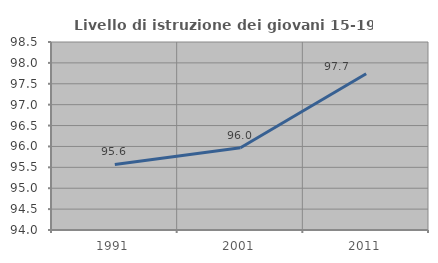
| Category | Livello di istruzione dei giovani 15-19 anni |
|---|---|
| 1991.0 | 95.57 |
| 2001.0 | 95.968 |
| 2011.0 | 97.74 |